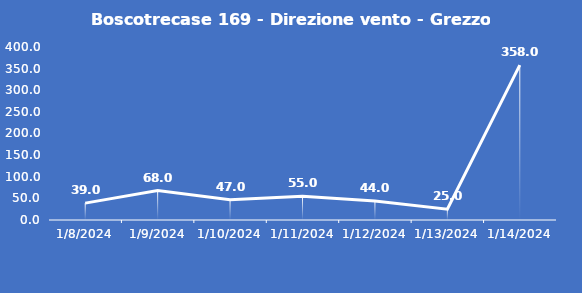
| Category | Boscotrecase 169 - Direzione vento - Grezzo (°N) |
|---|---|
| 1/8/24 | 39 |
| 1/9/24 | 68 |
| 1/10/24 | 47 |
| 1/11/24 | 55 |
| 1/12/24 | 44 |
| 1/13/24 | 25 |
| 1/14/24 | 358 |